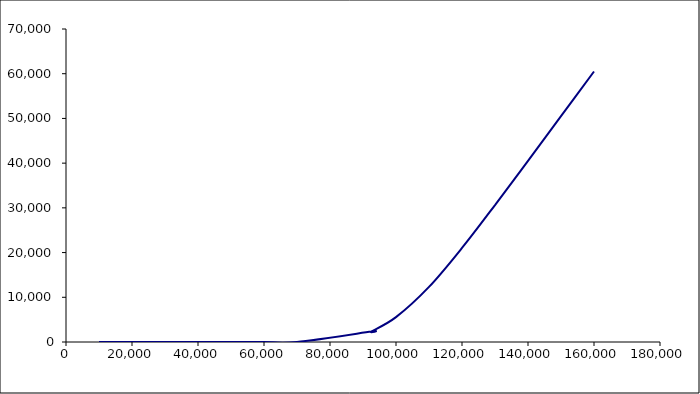
| Category | Series 0 |
|---|---|
| 10000.0 | 0 |
| 20000.0 | 0 |
| 30000.0 | 0 |
| 40000.0 | 0 |
| 50000.0 | 0 |
| 60000.0 | 0.182 |
| 70000.0 | 14.498 |
| 92500.0 | 2348.638 |
| 92600.0 | 2380.337 |
| 100000.0 | 5558.262 |
| 110000.0 | 12321.216 |
| 120000.0 | 21027.681 |
| 130000.0 | 30625.971 |
| 140000.0 | 40524.906 |
| 150000.0 | 50503.482 |
| 160000.0 | 60499.523 |